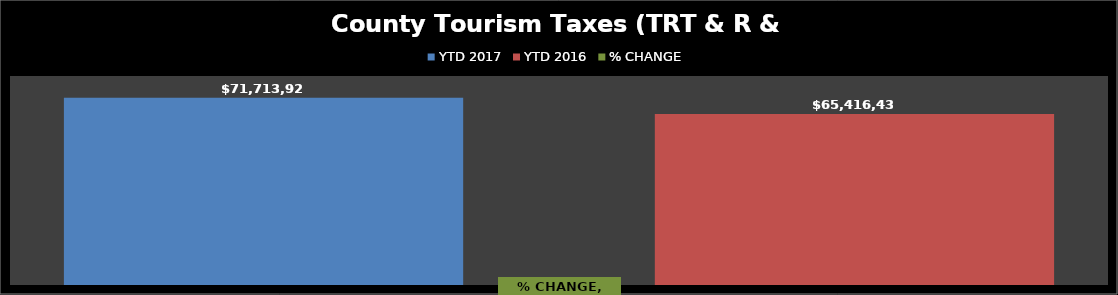
| Category | YTD 2017 | YTD 2016 |
|---|---|---|
| 0 | 71713923.38 | 65416431.311 |